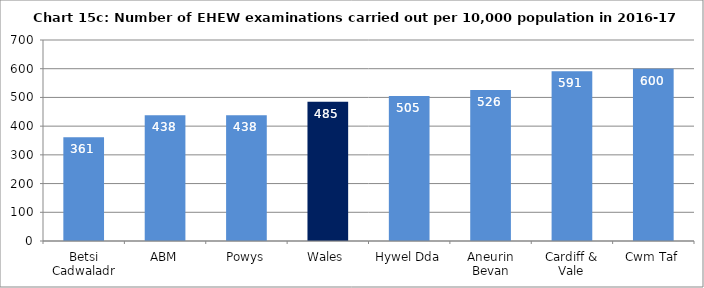
| Category | Chart 15c: Number of EHEW examinations carried out per 10,000 population in 2016-17 |
|---|---|
| Betsi Cadwaladr | 361.224 |
| ABM | 437.535 |
| Powys | 438.097 |
| Wales | 485.059 |
| Hywel Dda | 505.364 |
| Aneurin Bevan | 525.895 |
| Cardiff & Vale | 591.436 |
| Cwm Taf | 599.963 |